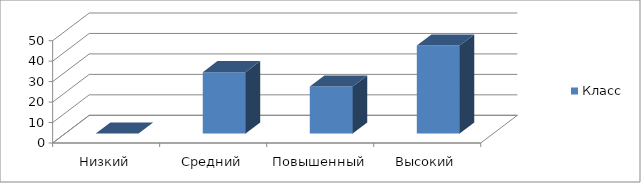
| Category | Класс |
|---|---|
| Низкий | 0 |
| Средний | 30 |
| Повышенный | 23 |
| Высокий | 43 |